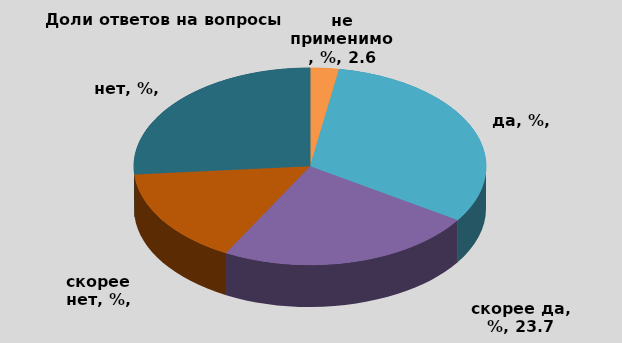
| Category | B1 |
|---|---|
| не применимо, % | 2.632 |
| да, % | 31.579 |
| скорее да, % | 23.684 |
| скорее нет, % | 15.789 |
| нет, % | 26.316 |